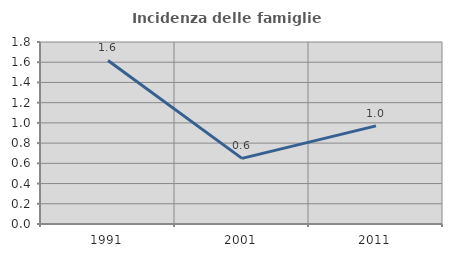
| Category | Incidenza delle famiglie numerose |
|---|---|
| 1991.0 | 1.617 |
| 2001.0 | 0.649 |
| 2011.0 | 0.971 |